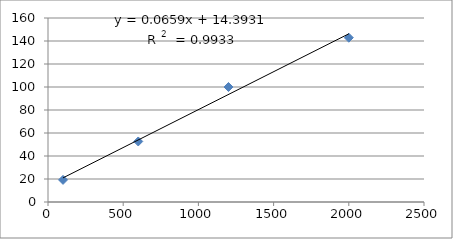
| Category | Series 0 |
|---|---|
| 100.0 | 19.231 |
| 600.0 | 52.632 |
| 1200.0 | 100 |
| 2000.0 | 142.857 |